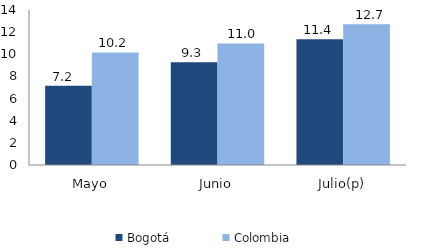
| Category | Bogotá | Colombia |
|---|---|---|
| Mayo | 7.162 | 10.168 |
| Junio | 9.275 | 10.981 |
| Julio(p) | 11.366 | 12.708 |